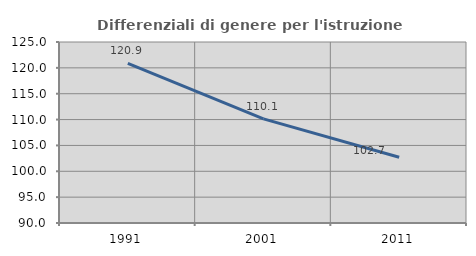
| Category | Differenziali di genere per l'istruzione superiore |
|---|---|
| 1991.0 | 120.867 |
| 2001.0 | 110.128 |
| 2011.0 | 102.719 |